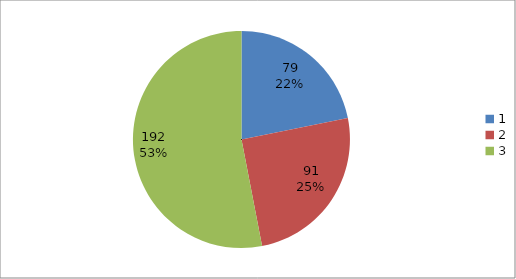
| Category | Series 0 |
|---|---|
| 0 | 79 |
| 1 | 91 |
| 2 | 192 |